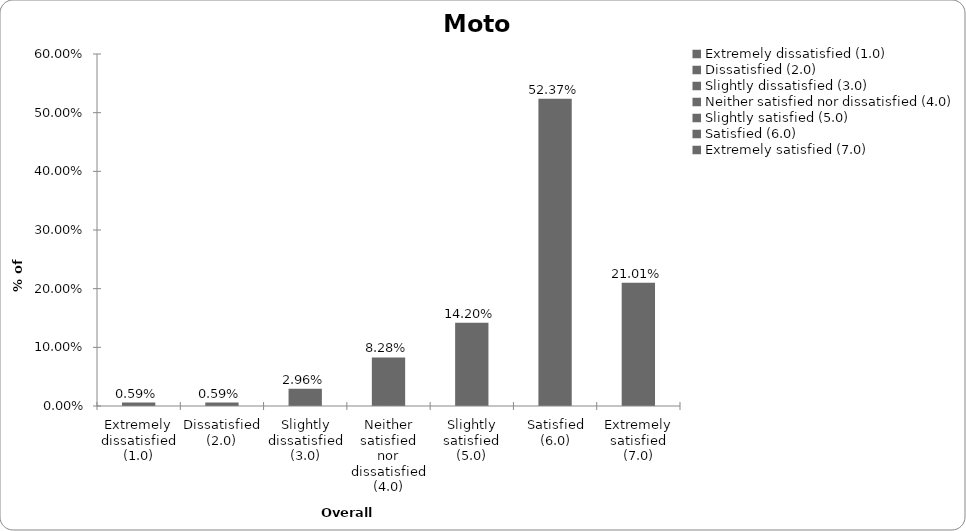
| Category | Motor |
|---|---|
| Extremely dissatisfied (1.0) | 0.006 |
| Dissatisfied (2.0) | 0.006 |
| Slightly dissatisfied (3.0) | 0.03 |
| Neither satisfied nor dissatisfied (4.0) | 0.083 |
| Slightly satisfied (5.0) | 0.142 |
| Satisfied (6.0) | 0.524 |
| Extremely satisfied (7.0) | 0.21 |